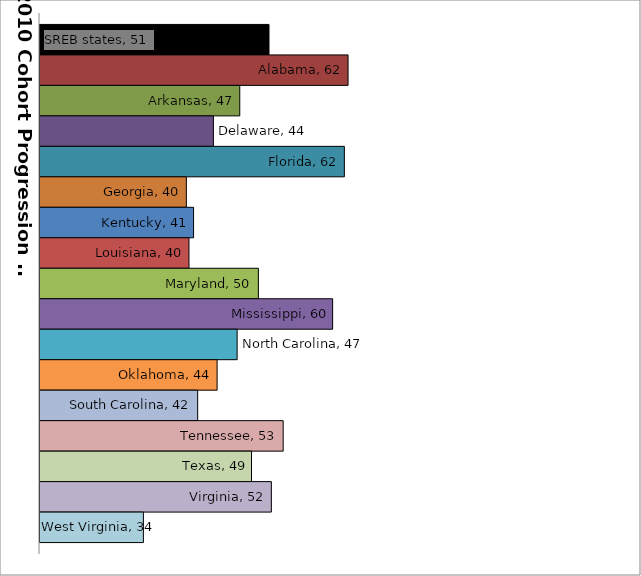
| Category | SREB states | Alabama | Arkansas | Delaware | Florida | Georgia | Kentucky | Louisiana | Maryland | Mississippi | North Carolina | Oklahoma | South Carolina | Tennessee | Texas | Virginia | West Virginia |
|---|---|---|---|---|---|---|---|---|---|---|---|---|---|---|---|---|---|
| 0 | 51.263 | 62.055 | 47.273 | 43.675 | 61.551 | 39.981 | 40.966 | 40.337 | 49.813 | 59.95 | 46.912 | 44.177 | 41.526 | 53.199 | 48.877 | 51.584 | 34.117 |